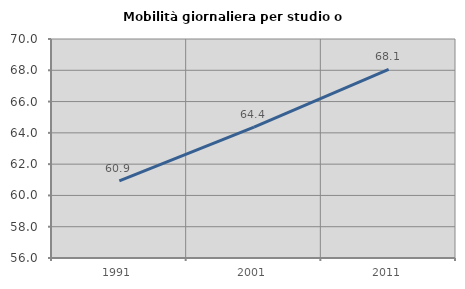
| Category | Mobilità giornaliera per studio o lavoro |
|---|---|
| 1991.0 | 60.933 |
| 2001.0 | 64.365 |
| 2011.0 | 68.053 |